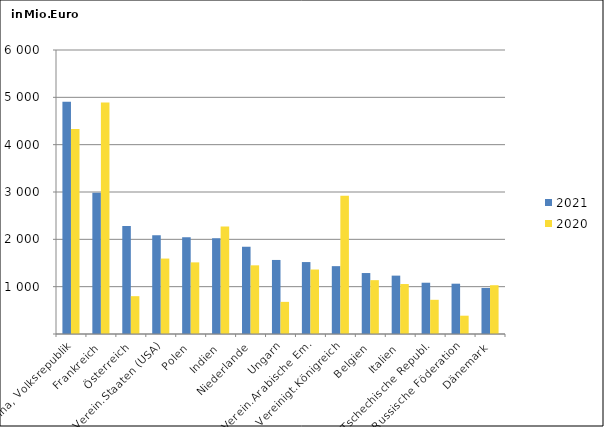
| Category | 2021 | 2020 |
|---|---|---|
| China, Volksrepublik | 4908.884 | 4328.462 |
| Frankreich | 2983.545 | 4891.694 |
| Österreich | 2280.556 | 799.033 |
| Verein.Staaten (USA) | 2086.627 | 1593.63 |
| Polen | 2046.577 | 1513.238 |
| Indien | 2023.782 | 2272.912 |
| Niederlande | 1844.581 | 1450.818 |
| Ungarn | 1564.415 | 678.658 |
| Verein.Arabische Em. | 1519.843 | 1362.16 |
| Vereinigt.Königreich | 1433.576 | 2921.809 |
| Belgien | 1288.055 | 1137.444 |
| Italien | 1233.181 | 1055.712 |
| Tschechische Republ. | 1083.4 | 722.615 |
| Russische Föderation | 1062.879 | 386.706 |
| Dänemark | 973.233 | 1030.657 |